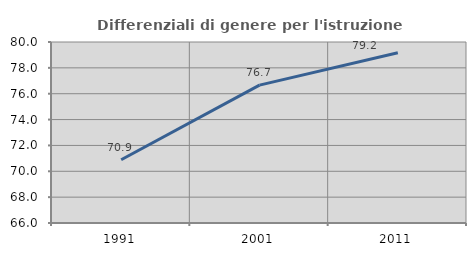
| Category | Differenziali di genere per l'istruzione superiore |
|---|---|
| 1991.0 | 70.894 |
| 2001.0 | 76.667 |
| 2011.0 | 79.167 |